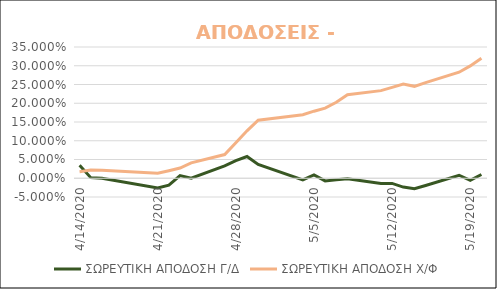
| Category | ΣΩΡΕΥΤΙΚΗ ΑΠΟΔΟΣΗ Γ/Δ | ΣΩΡΕΥΤΙΚΗ ΑΠΟΔΟΣΗ Χ/Φ |
|---|---|---|
| 4/14/20 | 0.034 | 0.018 |
| 4/15/20 | 0.002 | 0.022 |
| 4/16/20 | 0 | 0.021 |
| 4/21/20 | -0.026 | 0.013 |
| 4/22/20 | -0.018 | 0.02 |
| 4/23/20 | 0.007 | 0.027 |
| 4/24/20 | 0 | 0.041 |
| 4/27/20 | 0.033 | 0.063 |
| 4/28/20 | 0.047 | 0.095 |
| 4/29/20 | 0.058 | 0.126 |
| 4/30/20 | 0.037 | 0.155 |
| 5/4/20 | -0.005 | 0.17 |
| 5/5/20 | 0.009 | 0.179 |
| 5/6/20 | -0.007 | 0.187 |
| 5/7/20 | -0.004 | 0.203 |
| 5/8/20 | -0.002 | 0.223 |
| 5/11/20 | -0.014 | 0.234 |
| 5/12/20 | -0.014 | 0.242 |
| 5/13/20 | -0.023 | 0.251 |
| 5/14/20 | -0.028 | 0.245 |
| 5/15/20 | -0.019 | 0.255 |
| 5/18/20 | 0.008 | 0.283 |
| 5/19/20 | -0.006 | 0.3 |
| 5/20/20 | 0.01 | 0.32 |